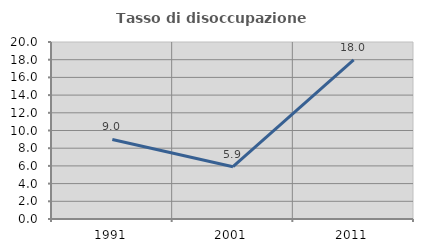
| Category | Tasso di disoccupazione giovanile  |
|---|---|
| 1991.0 | 8.991 |
| 2001.0 | 5.913 |
| 2011.0 | 17.993 |